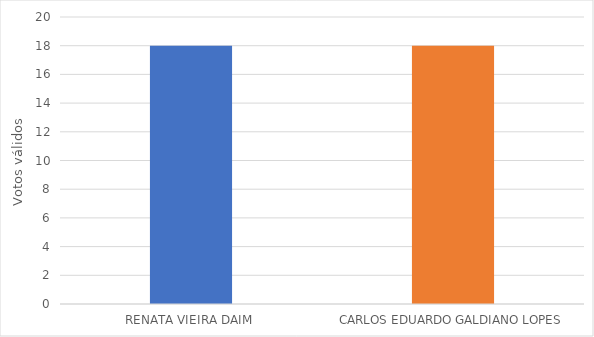
| Category | Series 0 |
|---|---|
| RENATA VIEIRA DAIM | 18 |
| CARLOS EDUARDO GALDIANO LOPES | 18 |